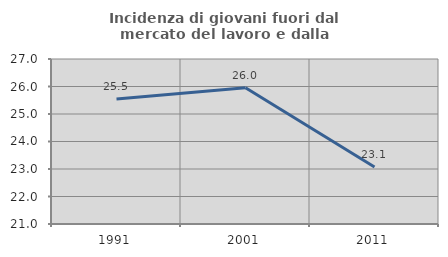
| Category | Incidenza di giovani fuori dal mercato del lavoro e dalla formazione  |
|---|---|
| 1991.0 | 25.546 |
| 2001.0 | 25.956 |
| 2011.0 | 23.069 |